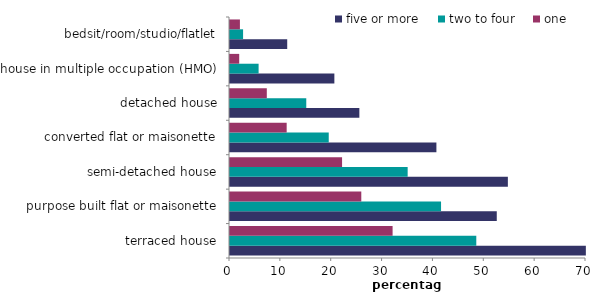
| Category | five or more | two to four | one |
|---|---|---|---|
| terraced house | 69.97 | 48.429 | 31.972 |
| purpose built flat or maisonette | 52.455 | 41.499 | 25.817 |
| semi-detached house | 54.636 | 34.933 | 22.036 |
| converted flat or maisonette | 40.586 | 19.416 | 11.146 |
| detached house | 25.436 | 14.997 | 7.237 |
| house in multiple occupation (HMO) | 20.521 | 5.624 | 1.811 |
| bedsit/room/studio/flatlet | 11.25 | 2.573 | 1.949 |